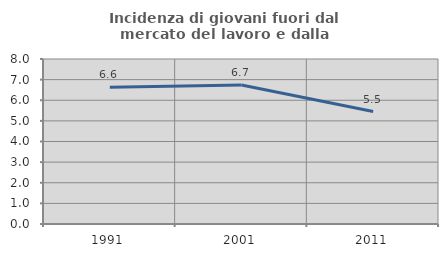
| Category | Incidenza di giovani fuori dal mercato del lavoro e dalla formazione  |
|---|---|
| 1991.0 | 6.629 |
| 2001.0 | 6.742 |
| 2011.0 | 5.452 |